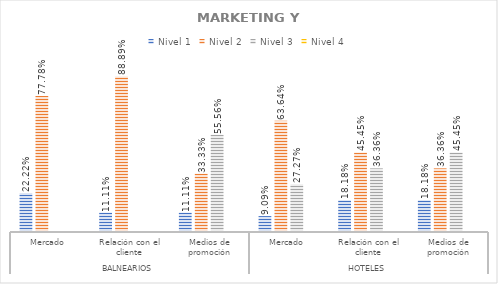
| Category | Nivel 1 | Nivel 2 | Nivel 3 | Nivel 4 |
|---|---|---|---|---|
| 0 | 0.222 | 0.778 | 0 | 0 |
| 1 | 0.111 | 0.889 | 0 | 0 |
| 2 | 0.111 | 0.333 | 0.556 | 0 |
| 3 | 0.091 | 0.636 | 0.273 | 0 |
| 4 | 0.182 | 0.455 | 0.364 | 0 |
| 5 | 0.182 | 0.364 | 0.455 | 0 |